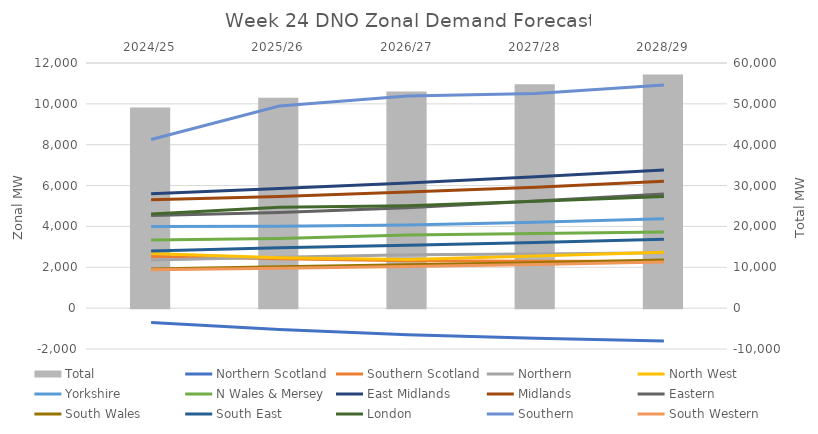
| Category | Total |
|---|---|
| 2024/25 | 49081.021 |
| 2025/26 | 51520.822 |
| 2026/27 | 53028.652 |
| 2027/28 | 54777.924 |
| 2028/29 | 57174.835 |